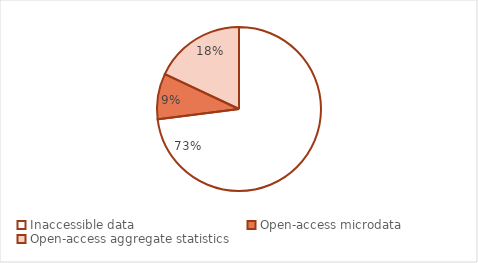
| Category | Series 0 |
|---|---|
| Inaccessible data | 0.73 |
| Open-access microdata | 0.09 |
| Open-access aggregate statistics | 0.18 |